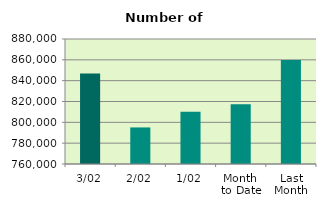
| Category | Series 0 |
|---|---|
| 3/02 | 846780 |
| 2/02 | 795096 |
| 1/02 | 810244 |
| Month 
to Date | 817373.333 |
| Last
Month | 859790.952 |